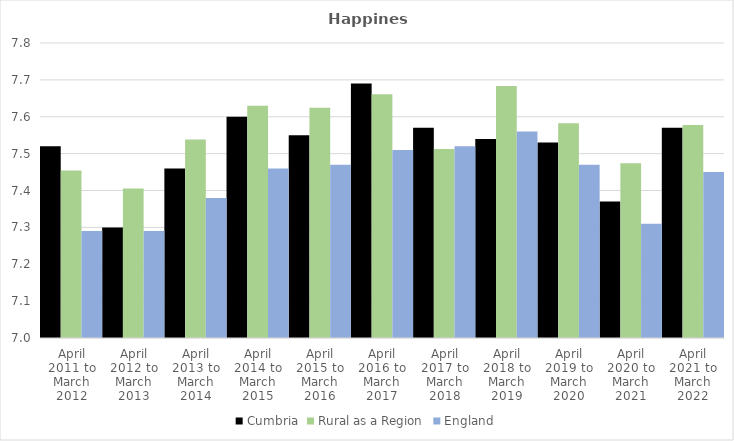
| Category | Cumbria | Rural as a Region | England |
|---|---|---|---|
| April 2011 to March 2012 | 7.52 | 7.454 | 7.29 |
| April 2012 to March 2013 | 7.3 | 7.406 | 7.29 |
| April 2013 to March 2014 | 7.46 | 7.539 | 7.38 |
| April 2014 to March 2015 | 7.6 | 7.63 | 7.46 |
| April 2015 to March 2016 | 7.55 | 7.625 | 7.47 |
| April 2016 to March 2017 | 7.69 | 7.661 | 7.51 |
| April 2017 to March 2018 | 7.57 | 7.513 | 7.52 |
| April 2018 to March 2019 | 7.54 | 7.684 | 7.56 |
| April 2019 to March 2020 | 7.53 | 7.582 | 7.47 |
| April 2020 to March 2021 | 7.37 | 7.474 | 7.31 |
| April 2021 to March 2022 | 7.57 | 7.577 | 7.45 |